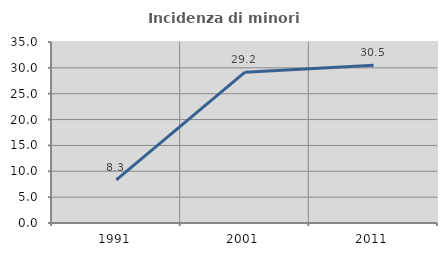
| Category | Incidenza di minori stranieri |
|---|---|
| 1991.0 | 8.333 |
| 2001.0 | 29.167 |
| 2011.0 | 30.527 |